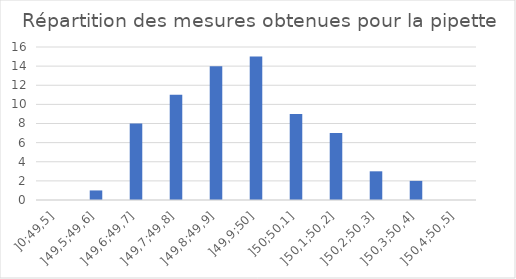
| Category | Series 0 |
|---|---|
| ]0;49,5] | 0 |
| ]49,5;49,6] | 1 |
| ]49,6;49,7] | 8 |
| ]49,7;49,8] | 11 |
| ]49,8;49,9] | 14 |
| ]49,9;50] | 15 |
| ]50;50,1] | 9 |
| ]50,1;50,2] | 7 |
| ]50,2;50,3] | 3 |
| ]50,3;50,4] | 2 |
| ]50,4;50,5] | 0 |